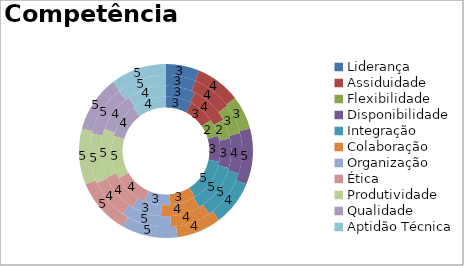
| Category | 1° Trim. | 2° Trim. | 3° Trim | 4° Trim. |
|---|---|---|---|---|
| Liderança | 3 | 3 | 3 | 3 |
| Assiduidade | 3 | 4 | 4 | 4 |
| Flexibilidade | 2 | 2 | 3 | 3 |
| Disponibilidade | 3 | 3 | 4 | 5 |
| Integração | 5 | 5 | 5 | 4 |
| Colaboração | 3 | 4 | 4 | 4 |
| Organização | 3 | 3 | 5 | 5 |
| Ética | 4 | 4 | 4 | 5 |
| Produtividade | 5 | 5 | 5 | 5 |
| Qualidade | 4 | 4 | 5 | 5 |
| Aptidão Técnica | 4 | 4 | 5 | 5 |